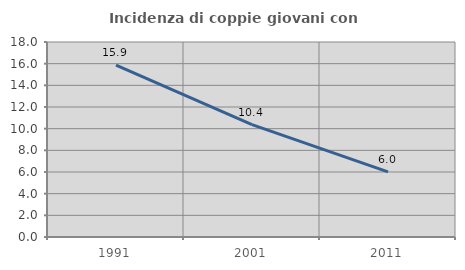
| Category | Incidenza di coppie giovani con figli |
|---|---|
| 1991.0 | 15.86 |
| 2001.0 | 10.376 |
| 2011.0 | 6.017 |